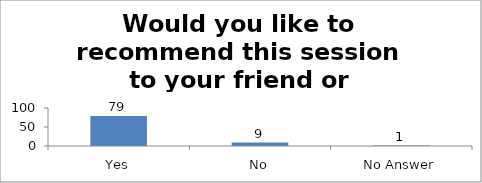
| Category | Would you like to recommend this session to your friend or colleague? |
|---|---|
| Yes | 79 |
| No | 9 |
| No Answer | 1 |